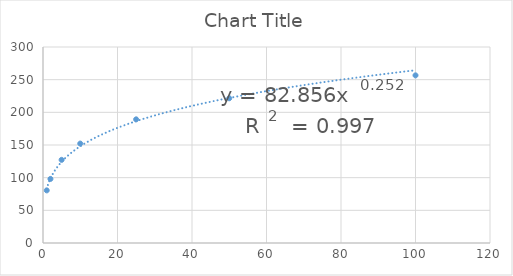
| Category | Series 0 |
|---|---|
| 1.0 | 80.537 |
| 2.0 | 98.067 |
| 5.0 | 127.284 |
| 10.0 | 152.182 |
| 25.0 | 189.275 |
| 50.0 | 221.54 |
| 100.0 | 256.601 |